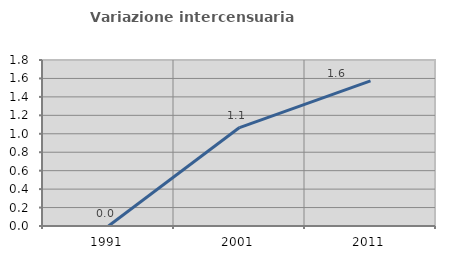
| Category | Variazione intercensuaria annua |
|---|---|
| 1991.0 | 0 |
| 2001.0 | 1.067 |
| 2011.0 | 1.573 |